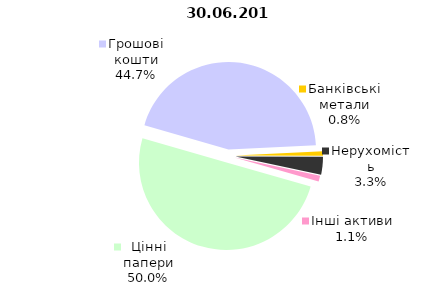
| Category | Всього |
|---|---|
| Цінні папери | 556331027.724 |
| Грошові кошти | 497272469.09 |
| Банківські метали | 9108891.97 |
| Нерухомість | 36644970.84 |
| Інші активи | 12443357.71 |